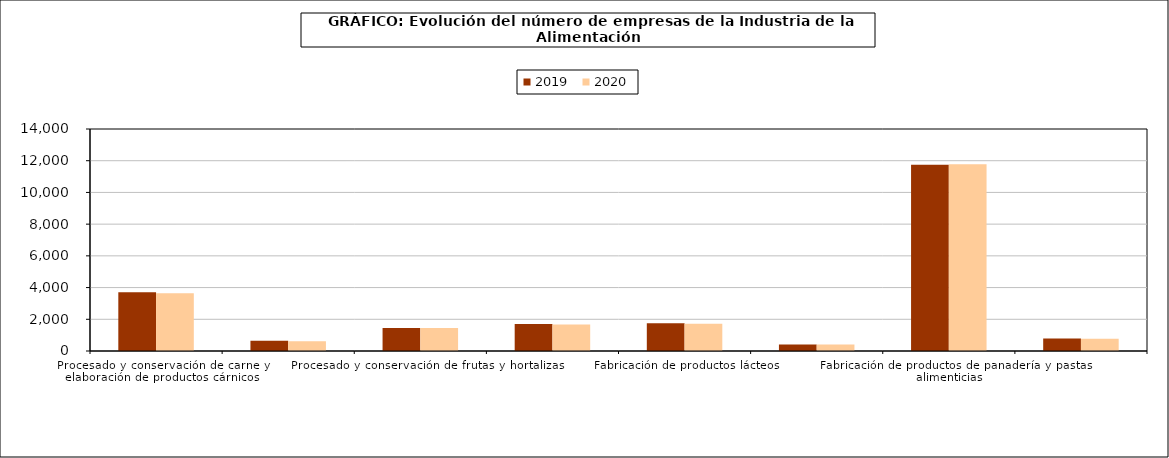
| Category | 2019 | 2020 |
|---|---|---|
| Procesado y conservación de carne y elaboración de productos cárnicos | 3705 | 3641 |
| Procesado y conservación de pescados, crustáceos y moluscos | 639 | 619 |
| Procesado y conservación de frutas y hortalizas | 1452 | 1456 |
| Fabricación de aceites y grasas vegetales y animales | 1708 | 1670 |
| Fabricación de productos lácteos | 1756 | 1726 |
| Fabricación de productos de molinería, almidones y productos amiláceos | 409 | 407 |
| Fabricación de productos de panadería y pastas alimenticias | 11745 | 11778 |
| Fabricación de productos para la alimentación animal | 782 | 775 |